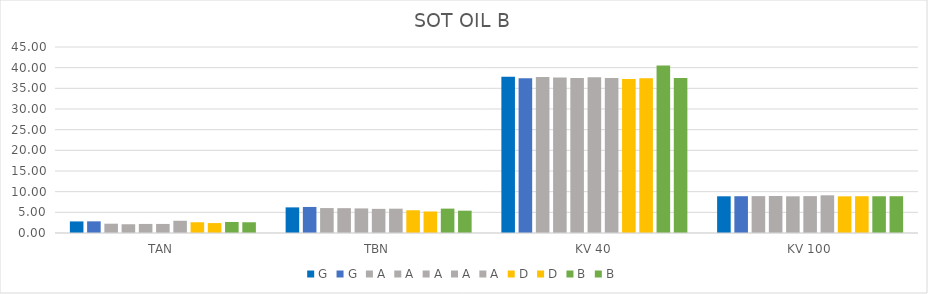
| Category | G | A | D | B |
|---|---|---|---|---|
| TAN | 2.82 | 2.96 | 2.4 | 2.6 |
| TBN | 6.3 | 5.88 | 5.2 | 5.4 |
| KV 40 | 37.42 | 37.49 | 37.46 | 37.47 |
| KV 100 | 8.9 | 9.12 | 8.9 | 8.9 |